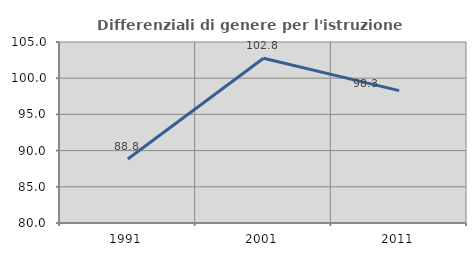
| Category | Differenziali di genere per l'istruzione superiore |
|---|---|
| 1991.0 | 88.838 |
| 2001.0 | 102.761 |
| 2011.0 | 98.289 |